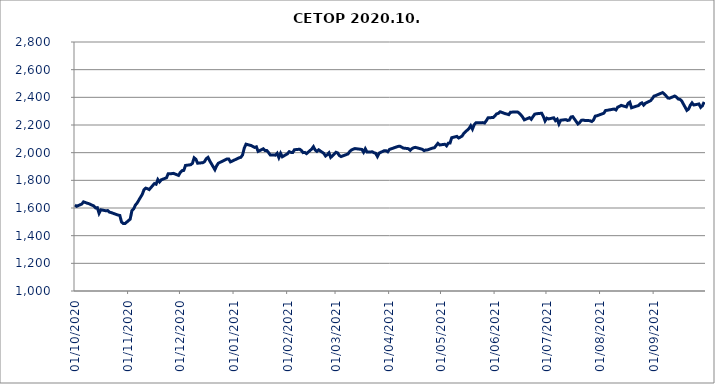
| Category | CETOP |
|---|---|
| 01/10/2020 | 1621.82 |
| 02/10/2020 | 1612.25 |
| 05/10/2020 | 1628.6 |
| 06/10/2020 | 1644.52 |
| 07/10/2020 | 1640.1 |
| 08/10/2020 | 1635.1 |
| 09/10/2020 | 1631.81 |
| 12/10/2020 | 1614.4 |
| 13/10/2020 | 1600.31 |
| 14/10/2020 | 1602.42 |
| 15/10/2020 | 1561.73 |
| 16/10/2020 | 1587.3 |
| 19/10/2020 | 1579.8 |
| 20/10/2020 | 1581.44 |
| 21/10/2020 | 1570.12 |
| 22/10/2020 | 1566.79 |
| 26/10/2020 | 1548.79 |
| 27/10/2020 | 1546.15 |
| 28/10/2020 | 1498.86 |
| 29/10/2020 | 1487.64 |
| 30/10/2020 | 1487.52 |
| 02/11/2020 | 1519.19 |
| 03/11/2020 | 1581.46 |
| 04/11/2020 | 1593.28 |
| 05/11/2020 | 1620.79 |
| 06/11/2020 | 1635.85 |
| 09/11/2020 | 1699.08 |
| 10/11/2020 | 1732.26 |
| 11/11/2020 | 1743.66 |
| 12/11/2020 | 1739.7 |
| 13/11/2020 | 1733.07 |
| 16/11/2020 | 1776.66 |
| 17/11/2020 | 1772.01 |
| 18/11/2020 | 1805.8 |
| 19/11/2020 | 1788.54 |
| 20/11/2020 | 1803.8 |
| 23/11/2020 | 1818.56 |
| 24/11/2020 | 1848.16 |
| 25/11/2020 | 1847.99 |
| 26/11/2020 | 1848.47 |
| 27/11/2020 | 1850.47 |
| 30/11/2020 | 1835.59 |
| 01/12/2020 | 1857.61 |
| 02/12/2020 | 1870.38 |
| 03/12/2020 | 1871.91 |
| 04/12/2020 | 1907.87 |
| 07/12/2020 | 1912.65 |
| 08/12/2020 | 1922.85 |
| 09/12/2020 | 1962.8 |
| 10/12/2020 | 1952.45 |
| 11/12/2020 | 1923.82 |
| 14/12/2020 | 1927.53 |
| 15/12/2020 | 1935.14 |
| 16/12/2020 | 1956.56 |
| 17/12/2020 | 1965.92 |
| 18/12/2020 | 1940.88 |
| 21/12/2020 | 1877.07 |
| 22/12/2020 | 1904.82 |
| 23/12/2020 | 1923.84 |
| 28/12/2020 | 1954.78 |
| 29/12/2020 | 1954.29 |
| 30/12/2020 | 1933.266 |
| 04/01/2021 | 1962.73 |
| 05/01/2021 | 1966.43 |
| 06/01/2021 | 1983.41 |
| 07/01/2021 | 2033.28 |
| 08/01/2021 | 2061.34 |
| 11/01/2021 | 2051.33 |
| 12/01/2021 | 2044.47 |
| 13/01/2021 | 2037.86 |
| 14/01/2021 | 2042.29 |
| 15/01/2021 | 2009.01 |
| 18/01/2021 | 2028.23 |
| 19/01/2021 | 2015.22 |
| 20/01/2021 | 2015.5 |
| 21/01/2021 | 2001.38 |
| 22/01/2021 | 1983.77 |
| 25/01/2021 | 1982.05 |
| 26/01/2021 | 1995.48 |
| 27/01/2021 | 1964.21 |
| 28/01/2021 | 1995.54 |
| 29/01/2021 | 1970.38 |
| 01/02/2021 | 1991.99 |
| 02/02/2021 | 2007.22 |
| 03/02/2021 | 2001.98 |
| 04/02/2021 | 2000.87 |
| 05/02/2021 | 2021.06 |
| 08/02/2021 | 2024.95 |
| 09/02/2021 | 2016.39 |
| 10/02/2021 | 2000.46 |
| 11/02/2021 | 2001.9 |
| 12/02/2021 | 1993.13 |
| 15/02/2021 | 2026.16 |
| 16/02/2021 | 2043.11 |
| 17/02/2021 | 2019.49 |
| 18/02/2021 | 2009.18 |
| 19/02/2021 | 2020.59 |
| 22/02/2021 | 1995 |
| 23/02/2021 | 1975.92 |
| 24/02/2021 | 1985.63 |
| 25/02/2021 | 1998.97 |
| 26/02/2021 | 1965.68 |
| 01/03/2021 | 2003.02 |
| 02/03/2021 | 1998.07 |
| 03/03/2021 | 1979.09 |
| 04/03/2021 | 1971.77 |
| 05/03/2021 | 1976.6 |
| 08/03/2021 | 1990.9 |
| 09/03/2021 | 2008.59 |
| 10/03/2021 | 2019.29 |
| 11/03/2021 | 2025.26 |
| 12/03/2021 | 2029.51 |
| 16/03/2021 | 2023.5 |
| 17/03/2021 | 2003.29 |
| 18/03/2021 | 2028.11 |
| 19/03/2021 | 2004.22 |
| 22/03/2021 | 2006.02 |
| 23/03/2021 | 1999.63 |
| 24/03/2021 | 1995.8 |
| 25/03/2021 | 1972.27 |
| 26/03/2021 | 1997.05 |
| 29/03/2021 | 2014.18 |
| 30/03/2021 | 2013.83 |
| 31/03/2021 | 2006.45 |
| 01/04/2021 | 2023.58 |
| 06/04/2021 | 2045.4 |
| 07/04/2021 | 2046.41 |
| 08/04/2021 | 2039.84 |
| 09/04/2021 | 2033.25 |
| 12/04/2021 | 2028.9 |
| 13/04/2021 | 2016.66 |
| 14/04/2021 | 2029.14 |
| 15/04/2021 | 2035.89 |
| 16/04/2021 | 2038.42 |
| 19/04/2021 | 2028.01 |
| 20/04/2021 | 2024 |
| 21/04/2021 | 2014.62 |
| 22/04/2021 | 2019.58 |
| 23/04/2021 | 2020.23 |
| 26/04/2021 | 2033.61 |
| 27/04/2021 | 2035.8 |
| 28/04/2021 | 2052.04 |
| 29/04/2021 | 2067.11 |
| 30/04/2021 | 2055.6 |
| 03/05/2021 | 2061.01 |
| 04/05/2021 | 2049.53 |
| 05/05/2021 | 2068.79 |
| 06/05/2021 | 2069.54 |
| 07/05/2021 | 2108.14 |
| 10/05/2021 | 2117.62 |
| 11/05/2021 | 2105.93 |
| 12/05/2021 | 2112.74 |
| 13/05/2021 | 2119.92 |
| 14/05/2021 | 2139.97 |
| 17/05/2021 | 2174.57 |
| 18/05/2021 | 2194.7 |
| 19/05/2021 | 2170.62 |
| 20/05/2021 | 2202.26 |
| 21/05/2021 | 2215.55 |
| 25/05/2021 | 2217.23 |
| 26/05/2021 | 2214.13 |
| 27/05/2021 | 2231.31 |
| 28/05/2021 | 2251.68 |
| 31/05/2021 | 2254.36 |
| 01/06/2021 | 2267.05 |
| 02/06/2021 | 2280.22 |
| 03/06/2021 | 2284.16 |
| 04/06/2021 | 2295.68 |
| 07/06/2021 | 2281.71 |
| 08/06/2021 | 2278.76 |
| 09/06/2021 | 2274.78 |
| 10/06/2021 | 2292.52 |
| 11/06/2021 | 2293.04 |
| 14/06/2021 | 2294.68 |
| 15/06/2021 | 2286.29 |
| 16/06/2021 | 2273.35 |
| 17/06/2021 | 2257.3 |
| 18/06/2021 | 2237.18 |
| 21/06/2021 | 2253.1 |
| 22/06/2021 | 2241.35 |
| 23/06/2021 | 2260.73 |
| 24/06/2021 | 2278.2 |
| 25/06/2021 | 2281.37 |
| 28/06/2021 | 2285.26 |
| 29/06/2021 | 2261.99 |
| 30/06/2021 | 2229.26 |
| 01/07/2021 | 2249.46 |
| 02/07/2021 | 2243.67 |
| 05/07/2021 | 2252.04 |
| 06/07/2021 | 2231.68 |
| 07/07/2021 | 2241.97 |
| 08/07/2021 | 2207.81 |
| 09/07/2021 | 2234.45 |
| 12/07/2021 | 2238.84 |
| 13/07/2021 | 2232.86 |
| 14/07/2021 | 2235.51 |
| 15/07/2021 | 2257.74 |
| 16/07/2021 | 2260.51 |
| 19/07/2021 | 2207.64 |
| 20/07/2021 | 2217.89 |
| 21/07/2021 | 2233.92 |
| 22/07/2021 | 2235.73 |
| 23/07/2021 | 2232.84 |
| 26/07/2021 | 2231.29 |
| 27/07/2021 | 2225.16 |
| 28/07/2021 | 2235.92 |
| 29/07/2021 | 2264.07 |
| 30/07/2021 | 2266.62 |
| 02/08/2021 | 2280.58 |
| 03/08/2021 | 2285.5 |
| 04/08/2021 | 2304.99 |
| 05/08/2021 | 2306.32 |
| 06/08/2021 | 2309.02 |
| 09/08/2021 | 2315.44 |
| 10/08/2021 | 2308.61 |
| 11/08/2021 | 2329.15 |
| 12/08/2021 | 2334.42 |
| 13/08/2021 | 2341.91 |
| 16/08/2021 | 2330.99 |
| 17/08/2021 | 2356.38 |
| 18/08/2021 | 2364.72 |
| 19/08/2021 | 2324.29 |
| 23/08/2021 | 2340.76 |
| 24/08/2021 | 2353.36 |
| 25/08/2021 | 2360.03 |
| 26/08/2021 | 2343.94 |
| 27/08/2021 | 2357.33 |
| 30/08/2021 | 2375.41 |
| 31/08/2021 | 2390.41 |
| 01/09/2021 | 2408.72 |
| 02/09/2021 | 2412.64 |
| 03/09/2021 | 2418.55 |
| 06/09/2021 | 2434.27 |
| 07/09/2021 | 2423.33 |
| 08/09/2021 | 2410.33 |
| 09/09/2021 | 2395.53 |
| 10/09/2021 | 2393.5 |
| 13/09/2021 | 2409.5 |
| 14/09/2021 | 2401.55 |
| 15/09/2021 | 2387.77 |
| 16/09/2021 | 2385.41 |
| 17/09/2021 | 2374.54 |
| 20/09/2021 | 2305.89 |
| 21/09/2021 | 2315.21 |
| 22/09/2021 | 2342.42 |
| 23/09/2021 | 2359.97 |
| 24/09/2021 | 2344.48 |
| 27/09/2021 | 2351.98 |
| 28/09/2021 | 2327.67 |
| 29/09/2021 | 2338.97 |
| 30/09/2021 | 2366.72 |